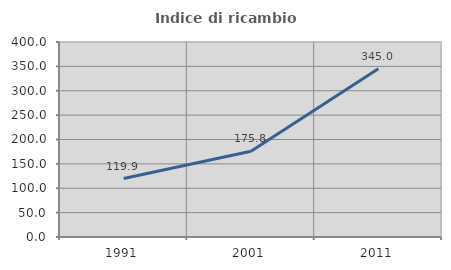
| Category | Indice di ricambio occupazionale  |
|---|---|
| 1991.0 | 119.853 |
| 2001.0 | 175.789 |
| 2011.0 | 345 |